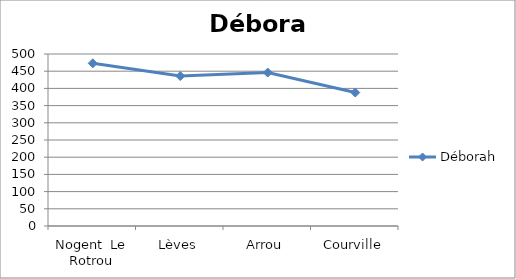
| Category | Déborah |
|---|---|
| Nogent  Le Rotrou | 473 |
| Lèves | 436 |
| Arrou | 446 |
| Courville | 388 |